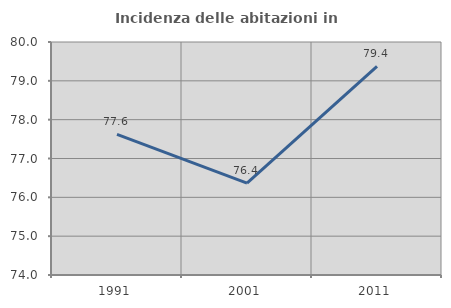
| Category | Incidenza delle abitazioni in proprietà  |
|---|---|
| 1991.0 | 77.619 |
| 2001.0 | 76.364 |
| 2011.0 | 79.372 |